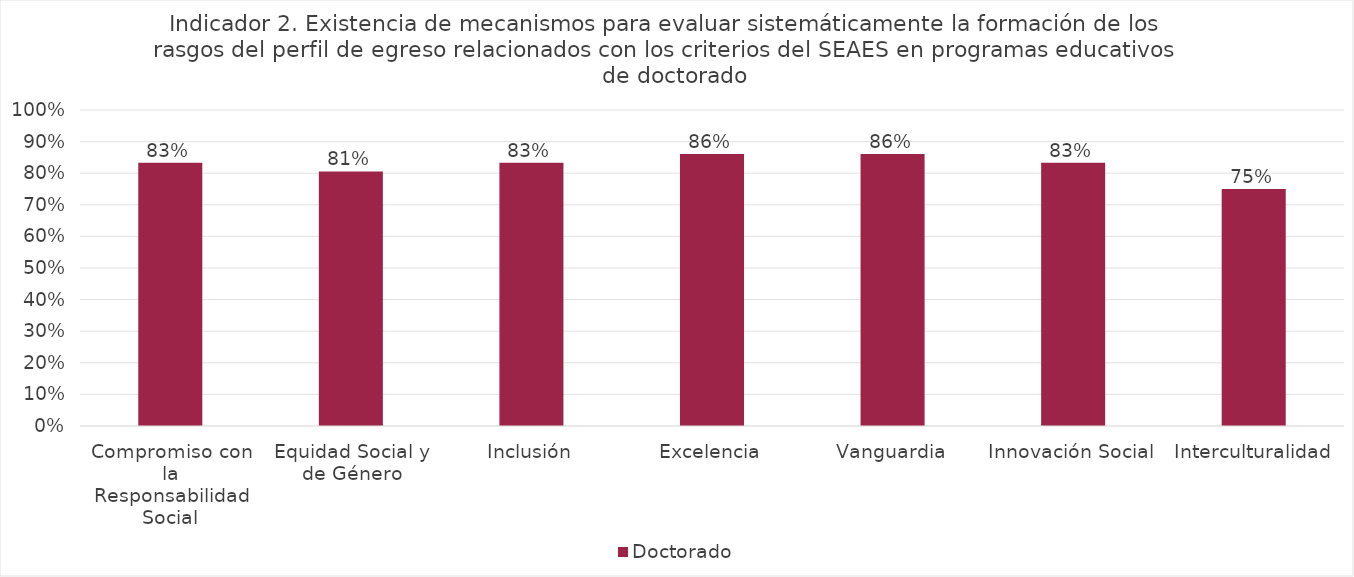
| Category | Doctorado |
|---|---|
| Compromiso con la Responsabilidad Social | 0.833 |
| Equidad Social y de Género | 0.806 |
| Inclusión | 0.833 |
| Excelencia | 0.861 |
| Vanguardia | 0.861 |
| Innovación Social | 0.833 |
| Interculturalidad | 0.75 |